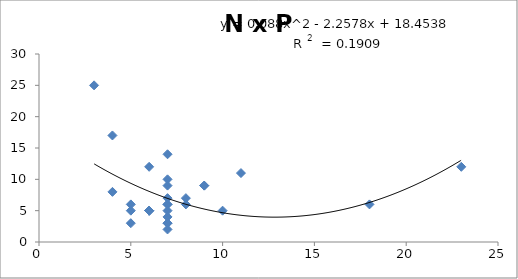
| Category | Series 0 |
|---|---|
| 7.0 | 14 |
| 8.0 | 7 |
| 7.0 | 6 |
| 7.0 | 3 |
| 7.0 | 3 |
| 6.0 | 5 |
| 6.0 | 5 |
| 3.0 | 25 |
| 4.0 | 17 |
| 9.0 | 9 |
| 7.0 | 4 |
| 7.0 | 2 |
| 6.0 | 5 |
| 6.0 | 12 |
| 10.0 | 5 |
| 5.0 | 3 |
| 18.0 | 6 |
| 23.0 | 12 |
| 11.0 | 11 |
| 7.0 | 9 |
| 7.0 | 5 |
| 8.0 | 6 |
| 7.0 | 6 |
| 5.0 | 5 |
| 9.0 | 9 |
| 5.0 | 6 |
| 7.0 | 7 |
| 7.0 | 10 |
| 4.0 | 8 |
| 6.0 | 5 |